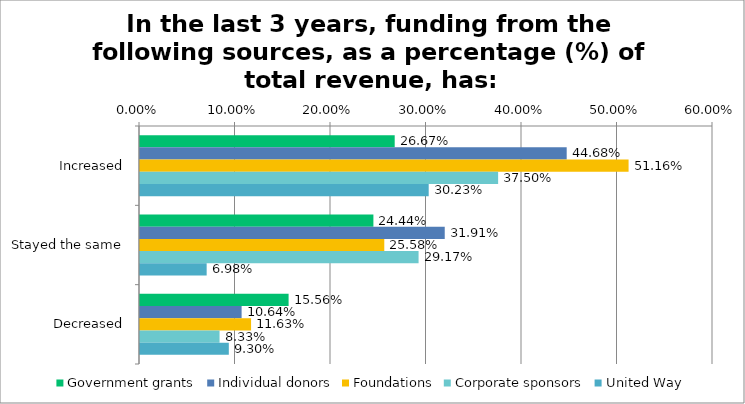
| Category | Government grants | Individual donors | Foundations | Corporate sponsors | United Way |
|---|---|---|---|---|---|
| Increased | 0.267 | 0.447 | 0.512 | 0.375 | 0.302 |
| Stayed the same | 0.244 | 0.319 | 0.256 | 0.292 | 0.07 |
| Decreased | 0.156 | 0.106 | 0.116 | 0.083 | 0.093 |